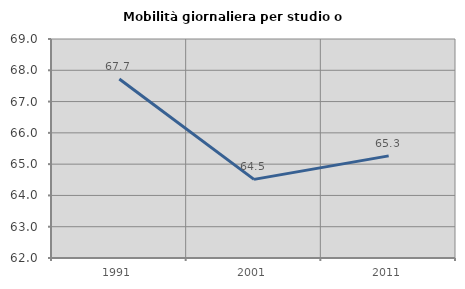
| Category | Mobilità giornaliera per studio o lavoro |
|---|---|
| 1991.0 | 67.722 |
| 2001.0 | 64.513 |
| 2011.0 | 65.264 |